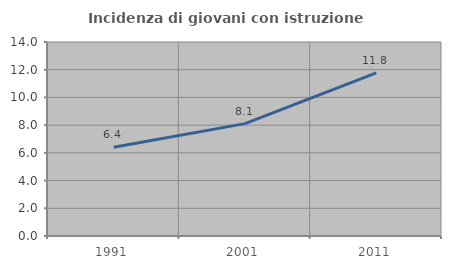
| Category | Incidenza di giovani con istruzione universitaria |
|---|---|
| 1991.0 | 6.41 |
| 2001.0 | 8.108 |
| 2011.0 | 11.765 |